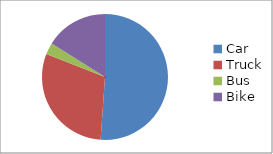
| Category | Series 0 |
|---|---|
| Car | 4493 |
| Truck | 2623 |
| Bus | 262 |
| Bike | 1412 |